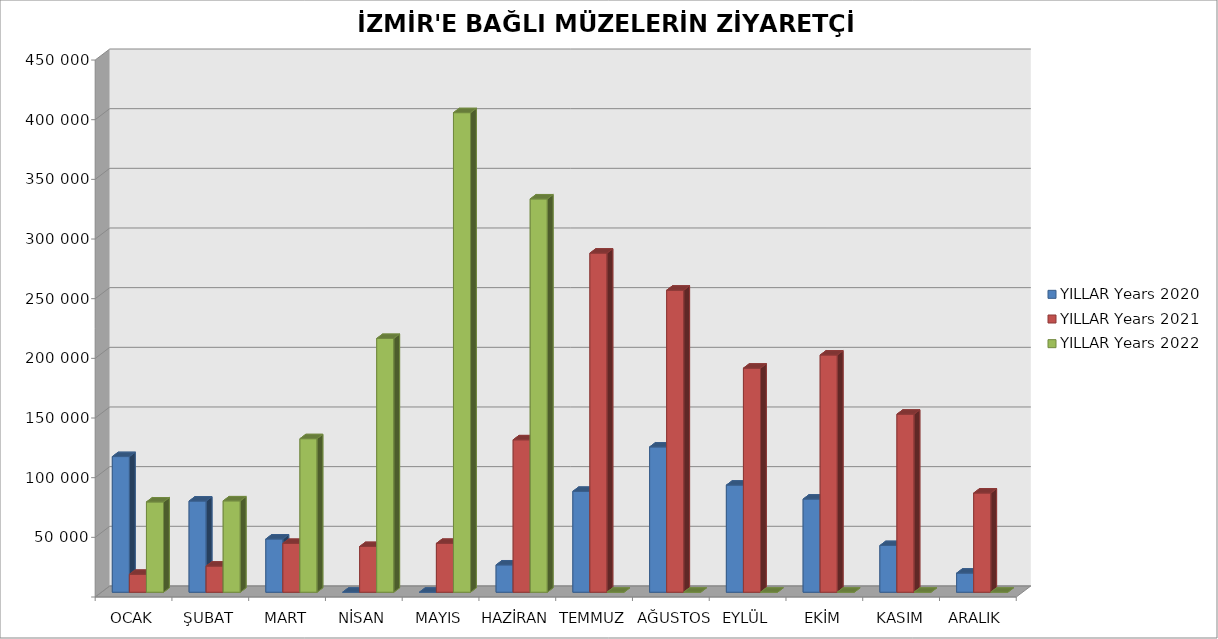
| Category | YILLAR |
|---|---|
| OCAK | 75648 |
| ŞUBAT | 76569 |
| MART | 128664 |
| NİSAN | 212657 |
| MAYIS | 401887 |
| HAZİRAN | 329617 |
| TEMMUZ | 0 |
| AĞUSTOS | 0 |
| EYLÜL | 0 |
| EKİM | 0 |
| KASIM | 0 |
| ARALIK | 0 |